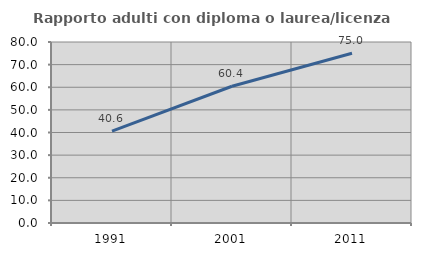
| Category | Rapporto adulti con diploma o laurea/licenza media  |
|---|---|
| 1991.0 | 40.58 |
| 2001.0 | 60.448 |
| 2011.0 | 75 |